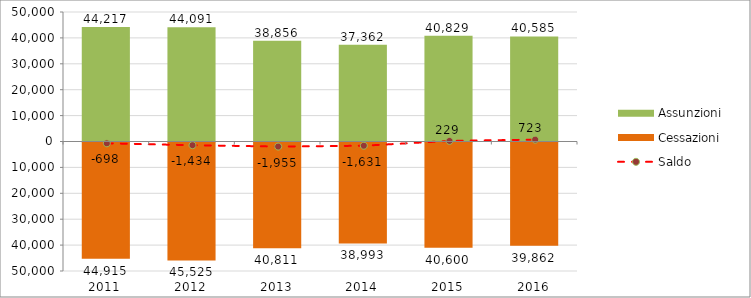
| Category | Assunzioni | Cessazioni |
|---|---|---|
| 2011.0 | 44217 | -44915 |
| 2012.0 | 44091 | -45525 |
| 2013.0 | 38856 | -40811 |
| 2014.0 | 37362 | -38993 |
| 2015.0 | 40829 | -40600 |
| 2016.0 | 40585 | -39862 |